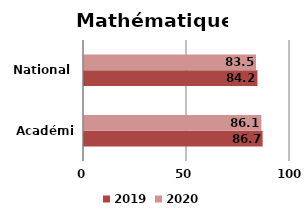
| Category | 2019 | 2020 |
|---|---|---|
| Académie | 86.7 | 86.1 |
| National | 84.2 | 83.5 |